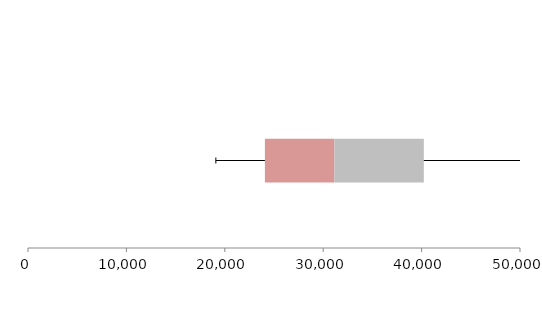
| Category | Series 1 | Series 2 | Series 3 |
|---|---|---|---|
| 0 | 24073.944 | 7058.347 | 9093.752 |